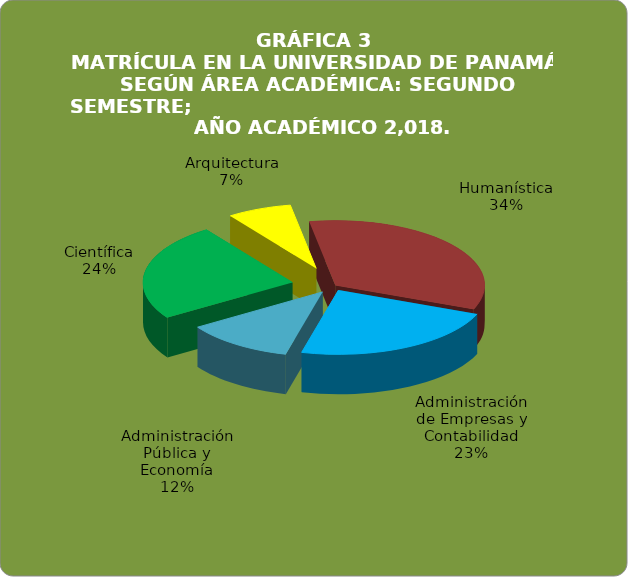
| Category | Series 0 |
|---|---|
| Humanística | 33.846 |
| Administración de Empresas y Contabilidad | 22.895 |
| Administración Pública y Economía | 11.805 |
| Científica | 24.47 |
| Arquitectura | 6.984 |